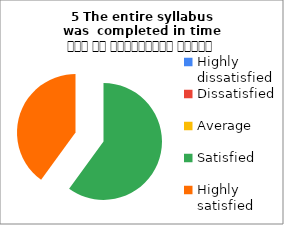
| Category | 5 The entire syllabus was  completed in time समय पर पाठ्यक्रम पूर्ण हुआ |
|---|---|
| Highly dissatisfied | 0 |
| Dissatisfied | 0 |
| Average | 0 |
| Satisfied | 3 |
| Highly satisfied | 2 |